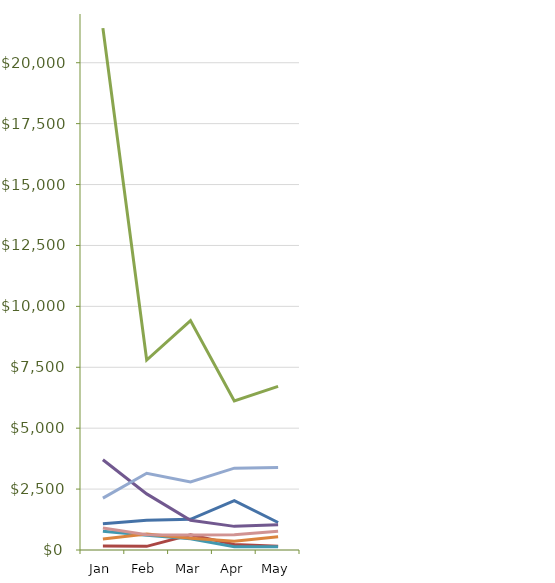
| Category | Dashboard Tutorial #1 | Excel Formula e-book | Excel School - Dashboards Membership | Excel School - Download Membership | Excel School - Online Membership | PM Templates for Excel [2003] | PM Templates for Excel [2007] | PM Templates for Excel [both] |
|---|---|---|---|---|---|---|---|---|
| Jan | 1073 | 160 | 21422.1 | 3702.75 | 774 | 450 | 2130 | 900 |
| Feb | 1221 | 150 | 7795.2 | 2302.5 | 602 | 660 | 3151.47 | 630 |
| Mar | 1258 | 620 | 9414.84 | 1216.6 | 462.3 | 480 | 2791.21 | 615 |
| Apr | 2027.6 | 230 | 6120.9 | 970 | 134 | 360 | 3360 | 630 |
| May | 1128 | 150 | 6718.6 | 1037.9 | 134 | 540 | 3390 | 765 |